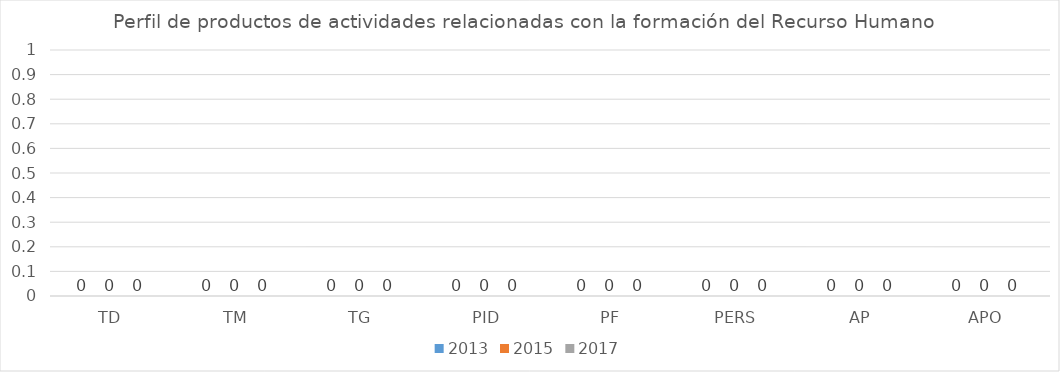
| Category | 2013 | 2015 | 2017 |
|---|---|---|---|
| TD | 0 | 0 | 0 |
| TM | 0 | 0 | 0 |
| TG | 0 | 0 | 0 |
| PID | 0 | 0 | 0 |
| PF | 0 | 0 | 0 |
| PERS | 0 | 0 | 0 |
| AP | 0 | 0 | 0 |
| APO | 0 | 0 | 0 |